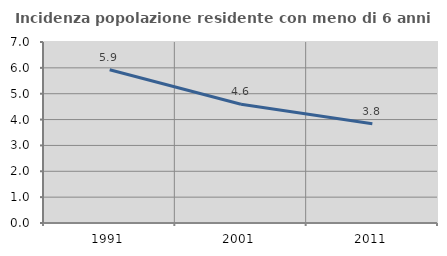
| Category | Incidenza popolazione residente con meno di 6 anni |
|---|---|
| 1991.0 | 5.927 |
| 2001.0 | 4.591 |
| 2011.0 | 3.842 |